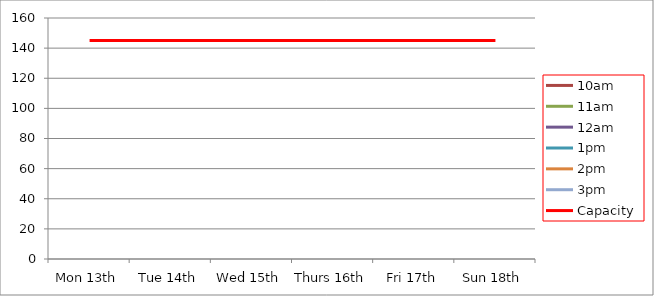
| Category | 9am | 10am | 11am | 12am | 1pm | 2pm | 3pm | 4pm | 5pm | Capacity |
|---|---|---|---|---|---|---|---|---|---|---|
| Mon 13th |  |  |  |  |  |  |  |  |  | 145 |
| Tue 14th |  |  |  |  |  |  |  |  |  | 145 |
| Wed 15th |  |  |  |  |  |  |  |  |  | 145 |
| Thurs 16th |  |  |  |  |  |  |  |  |  | 145 |
| Fri 17th |  |  |  |  |  |  |  |  |  | 145 |
| Sun 18th |  |  |  |  |  |  |  |  |  | 145 |